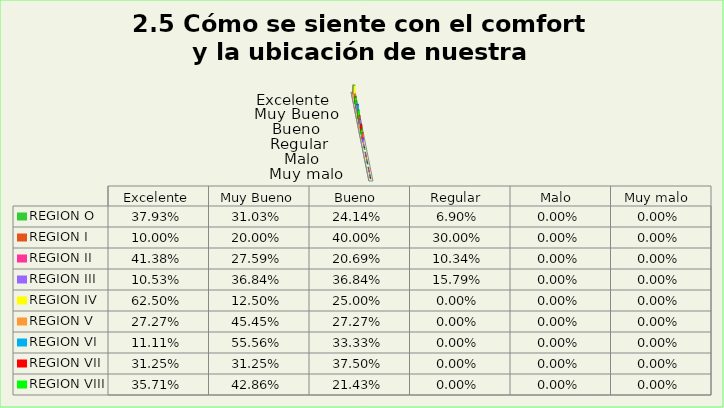
| Category | REGION O | REGION I  | REGION II | REGION III | REGION IV | REGION V  | REGION VI  | REGION VII  | REGION VIII |
|---|---|---|---|---|---|---|---|---|---|
| Excelente | 0.379 | 0.1 | 0.414 | 0.105 | 0.625 | 0.273 | 0.111 | 0.312 | 0.357 |
| Muy Bueno | 0.31 | 0.2 | 0.276 | 0.368 | 0.125 | 0.455 | 0.556 | 0.312 | 0.429 |
| Bueno  | 0.241 | 0.4 | 0.207 | 0.368 | 0.25 | 0.273 | 0.333 | 0.375 | 0.214 |
| Regular  | 0.069 | 0.3 | 0.103 | 0.158 | 0 | 0 | 0 | 0 | 0 |
| Malo  | 0 | 0 | 0 | 0 | 0 | 0 | 0 | 0 | 0 |
| Muy malo  | 0 | 0 | 0 | 0 | 0 | 0 | 0 | 0 | 0 |